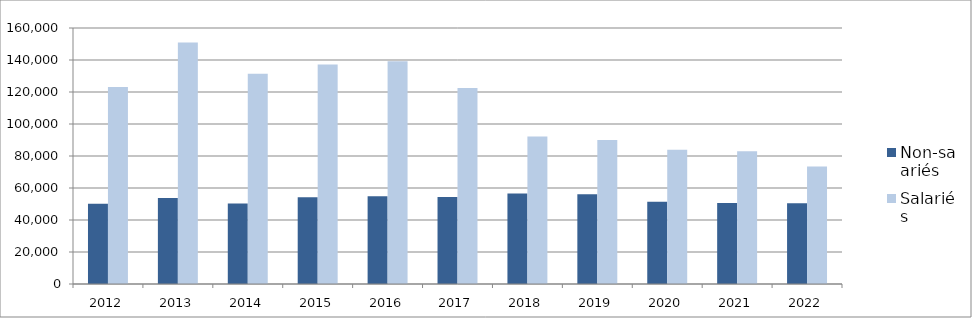
| Category | Non-salariés | Salariés |
|---|---|---|
| 2012.0 | 50157 | 123103 |
| 2013.0 | 53676 | 151007 |
| 2014.0 | 50301 | 131334 |
| 2015.0 | 54196 | 137183 |
| 2016.0 | 54919 | 139214 |
| 2017.0 | 54399 | 122553 |
| 2018.0 | 56541 | 92210 |
| 2019.0 | 56041 | 90010 |
| 2020.0 | 51423 | 83955 |
| 2021.0 | 50592 | 82907 |
| 2022.0 | 50423 | 73391 |